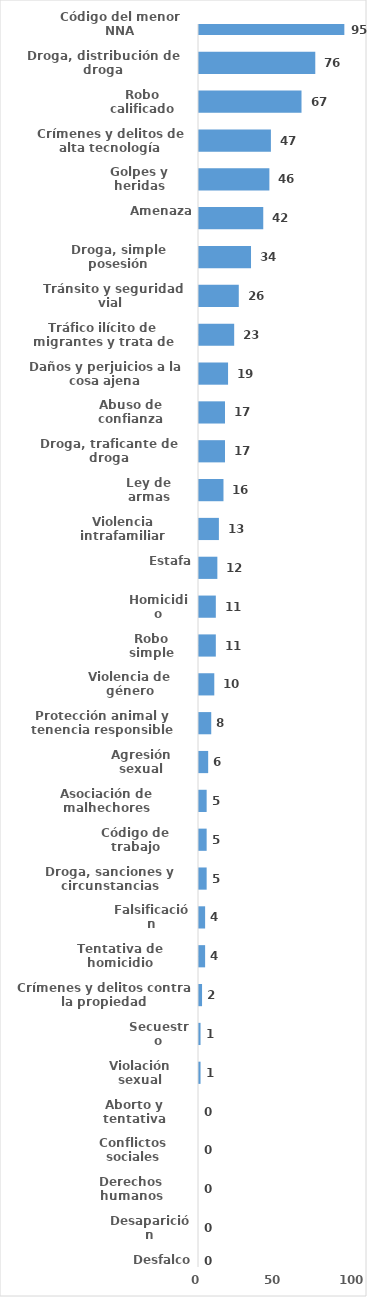
| Category | Series 0 |
|---|---|
| Código del menor NNA | 95 |
| Droga, distribución de droga | 76 |
| Robo calificado | 67 |
| Crímenes y delitos de alta tecnología | 47 |
| Golpes y heridas | 46 |
| Amenaza | 42 |
| Droga, simple posesión | 34 |
| Tránsito y seguridad vial  | 26 |
| Tráfico ilícito de migrantes y trata de personas | 23 |
| Daños y perjuicios a la cosa ajena | 19 |
| Abuso de confianza | 17 |
| Droga, traficante de droga | 17 |
| Ley de armas | 16 |
| Violencia intrafamiliar | 13 |
| Estafa | 12 |
| Homicidio | 11 |
| Robo simple | 11 |
| Violencia de género | 10 |
| Protección animal y tenencia responsible | 8 |
| Agresión sexual | 6 |
| Asociación de malhechores | 5 |
| Código de trabajo | 5 |
| Droga, sanciones y circunstancias agravantes | 5 |
| Falsificación | 4 |
| Tentativa de homicidio | 4 |
| Crímenes y delitos contra la propiedad | 2 |
| Secuestro | 1 |
| Violación sexual | 1 |
| Aborto y tentativa | 0 |
| Conflictos sociales | 0 |
| Derechos humanos | 0 |
| Desaparición | 0 |
| Desfalco | 0 |